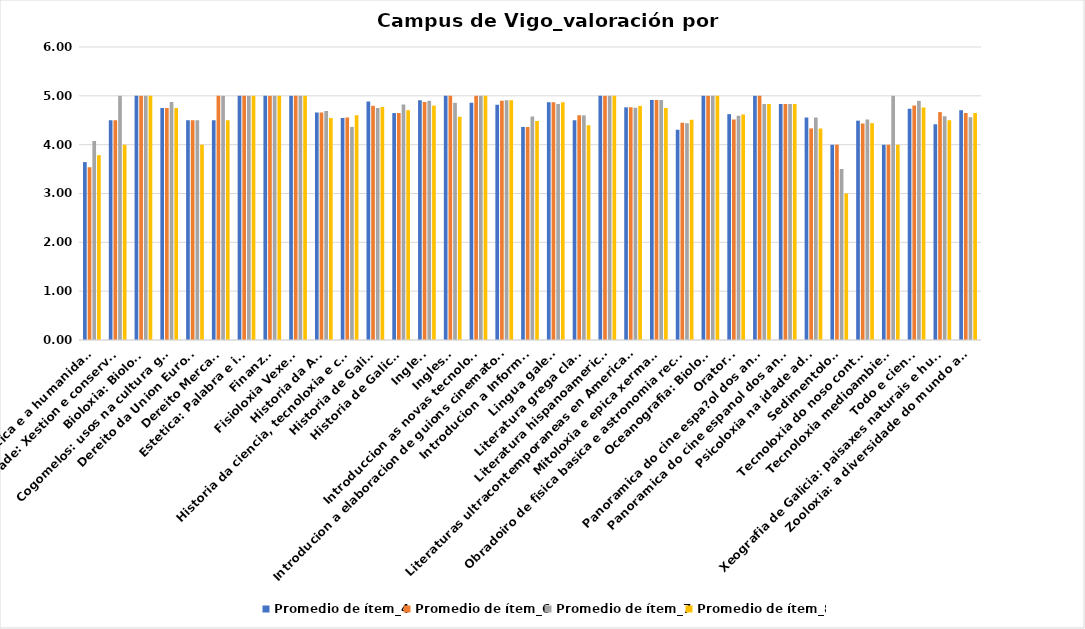
| Category | Promedio de ítem_4 | Promedio de ítem_6 | Promedio de ítem_7 | Promedio de ítem_8 |
|---|---|---|---|---|
| A xenetica e a humanidade 1 | 3.643 | 3.538 | 4.077 | 3.786 |
| Biodiversidade: Xestion e conservacion | 4.5 | 4.5 | 5 | 4 |
| Bioloxia: Bioloxia | 5 | 5 | 5 | 5 |
| Cogomelos: usos na cultura galega | 4.75 | 4.75 | 4.875 | 4.75 |
| Dereito da Union Europea | 4.5 | 4.5 | 4.5 | 4 |
| Dereito Mercantil | 4.5 | 5 | 5 | 4.5 |
| Estetica: Palabra e imaxe | 5 | 5 | 5 | 5 |
| Finanzas | 5 | 5 | 5 | 5 |
| Fisioloxia Vexetal I | 5 | 5 | 5 | 5 |
| Historia da Arte | 4.656 | 4.656 | 4.688 | 4.545 |
| Historia da ciencia, tecnoloxia e cultura | 4.545 | 4.556 | 4.364 | 4.6 |
| Historia de Galicia I | 4.886 | 4.795 | 4.75 | 4.773 |
| Historia de Galicia II | 4.647 | 4.647 | 4.824 | 4.706 |
| Ingles I | 4.909 | 4.875 | 4.9 | 4.8 |
| Ingles III | 5 | 5 | 4.857 | 4.571 |
| Introduccion as novas tecnoloxias II | 4.857 | 5 | 5 | 5 |
| Introducion a elaboracion de guions cinematograficos | 4.818 | 4.9 | 4.909 | 4.909 |
| Introducion a Informatica | 4.364 | 4.364 | 4.576 | 4.485 |
| Lingua galega | 4.867 | 4.867 | 4.833 | 4.867 |
| Literatura grega clasica | 4.5 | 4.6 | 4.6 | 4.4 |
| Literatura hispanoamericana I | 5 | 5 | 5 | 5 |
| Literaturas ultracontemporaneas en America Latina | 4.765 | 4.765 | 4.758 | 4.794 |
| Mitoloxia e epica xermanicas | 4.917 | 4.917 | 4.917 | 4.75 |
| Obradoiro de fisica basica e astronomia recreativa | 4.305 | 4.448 | 4.439 | 4.509 |
| Oceanografia: Bioloxia I | 5 | 5 | 5 | 5 |
| Oratoria | 4.625 | 4.513 | 4.59 | 4.615 |
| Panoramica do cine espa?ol dos anos 50 | 5 | 5 | 4.833 | 4.833 |
| Panoramica do cine espanol dos anos 50 | 4.833 | 4.833 | 4.833 | 4.833 |
| Psicoloxia na idade adulta I | 4.556 | 4.333 | 4.556 | 4.333 |
| Sedimentoloxia | 4 | 4 | 3.5 | 3 |
| Tecnoloxia do noso contorno | 4.492 | 4.431 | 4.517 | 4.441 |
| Tecnoloxia medioambiental | 4 | 4 | 5 | 4 |
| Todo e ciencia | 4.733 | 4.8 | 4.897 | 4.759 |
| Xeografia de Galicia: paisaxes naturais e humanas | 4.417 | 4.667 | 4.583 | 4.5 |
| Zooloxia: a diversidade do mundo animal | 4.706 | 4.647 | 4.562 | 4.647 |